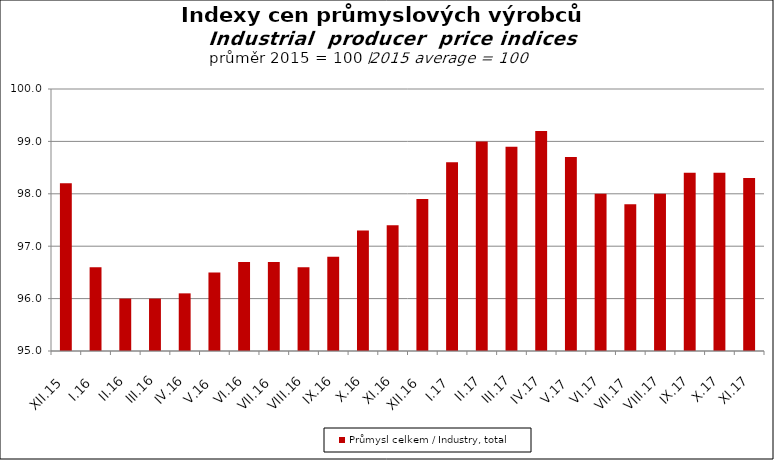
| Category | Průmysl celkem / Industry, total |
|---|---|
| XII.15 | 98.2 |
| I.16 | 96.6 |
| II.16 | 96 |
| III.16 | 96 |
| IV.16 | 96.1 |
| V.16 | 96.5 |
| VI.16 | 96.7 |
| VII.16 | 96.7 |
| VIII.16 | 96.6 |
| IX.16 | 96.8 |
| X.16 | 97.3 |
| XI.16 | 97.4 |
| XII.16 | 97.9 |
| I.17 | 98.6 |
| II.17 | 99 |
| III.17 | 98.9 |
| IV.17 | 99.2 |
| V.17 | 98.7 |
| VI.17 | 98 |
| VII.17 | 97.8 |
| VIII.17 | 98 |
| IX.17 | 98.4 |
| X.17 | 98.4 |
| XI.17 | 98.3 |